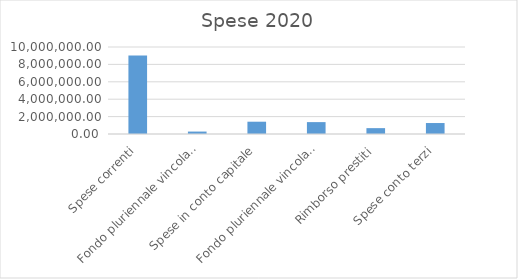
| Category | Series 0 |
|---|---|
| Spese correnti | 9035982.71 |
| Fondo pluriennale vincolato p/corrente | 279732.026 |
| Spese in conto capitale | 1412367.59 |
| Fondo pluriennale vincolato p/capitale | 1366561.48 |
| Rimborso prestiti | 673447.24 |
| Spese conto terzi | 1261203.74 |